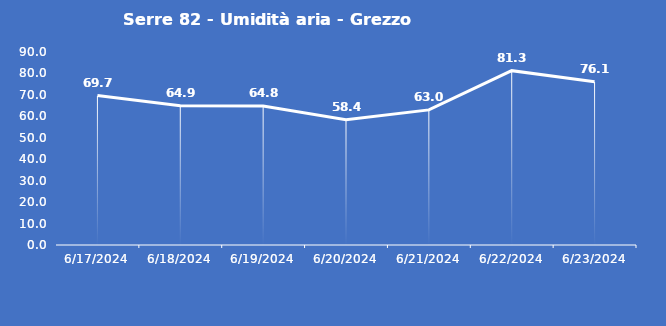
| Category | Serre 82 - Umidità aria - Grezzo (%) |
|---|---|
| 6/17/24 | 69.7 |
| 6/18/24 | 64.9 |
| 6/19/24 | 64.8 |
| 6/20/24 | 58.4 |
| 6/21/24 | 63 |
| 6/22/24 | 81.3 |
| 6/23/24 | 76.1 |